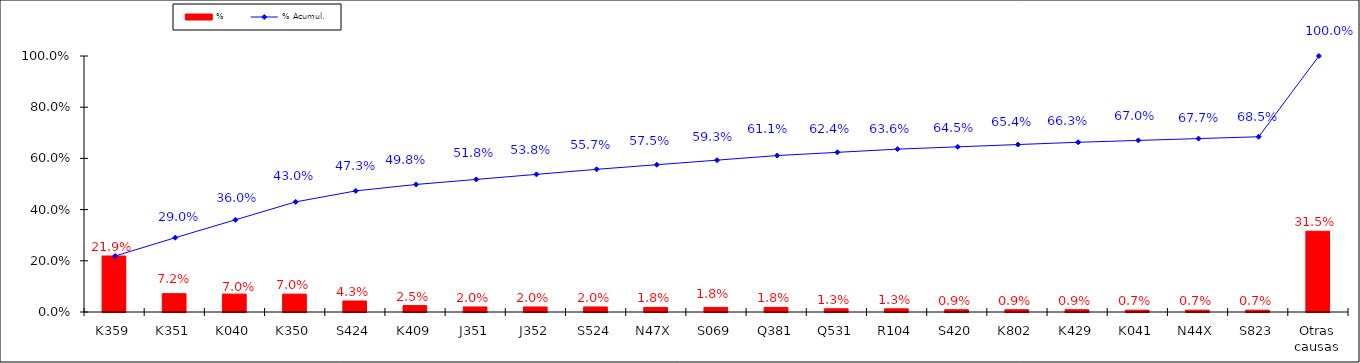
| Category | % |
|---|---|
| K359 | 0.219 |
| K351 | 0.072 |
| K040 | 0.07 |
| K350 | 0.07 |
| S424 | 0.043 |
| K409 | 0.025 |
| J351 | 0.02 |
| J352 | 0.02 |
| S524 | 0.02 |
| N47X | 0.018 |
| S069 | 0.018 |
| Q381 | 0.018 |
| Q531 | 0.013 |
| R104 | 0.013 |
| S420 | 0.009 |
| K802 | 0.009 |
| K429 | 0.009 |
| K041 | 0.007 |
| N44X | 0.007 |
| S823 | 0.007 |
| Otras causas | 0.315 |